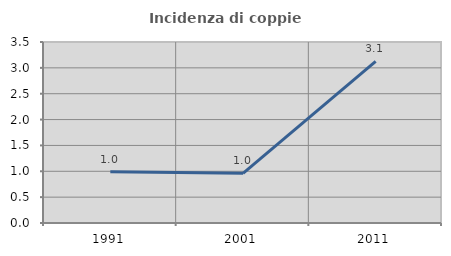
| Category | Incidenza di coppie miste |
|---|---|
| 1991.0 | 0.99 |
| 2001.0 | 0.962 |
| 2011.0 | 3.125 |